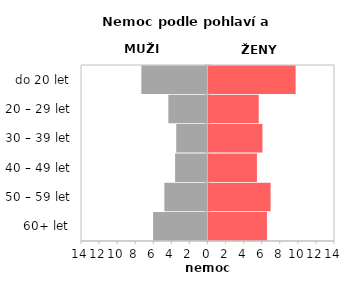
| Category | Nemoc |
|---|---|
| 60+ let | 6.469 |
| 50 – 59 let | 6.871 |
| 40 – 49 let | 5.36 |
| 30 – 39 let | 5.97 |
| 20 – 29 let | 5.557 |
| do 20 let | 9.639 |